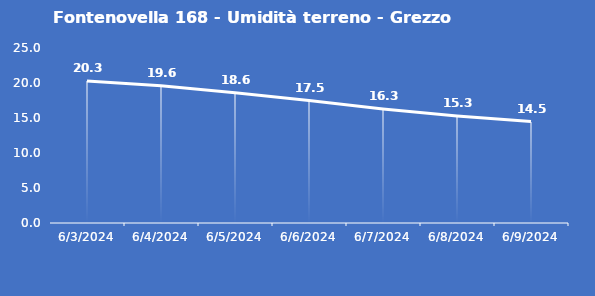
| Category | Fontenovella 168 - Umidità terreno - Grezzo (%VWC) |
|---|---|
| 6/3/24 | 20.3 |
| 6/4/24 | 19.6 |
| 6/5/24 | 18.6 |
| 6/6/24 | 17.5 |
| 6/7/24 | 16.3 |
| 6/8/24 | 15.3 |
| 6/9/24 | 14.5 |